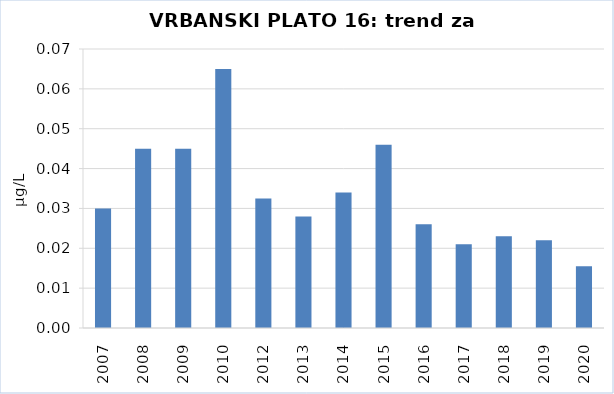
| Category | Vsota |
|---|---|
| 2007 | 0.03 |
| 2008 | 0.045 |
| 2009 | 0.045 |
| 2010 | 0.065 |
| 2012 | 0.032 |
| 2013 | 0.028 |
| 2014 | 0.034 |
| 2015 | 0.046 |
| 2016 | 0.026 |
| 2017 | 0.021 |
| 2018 | 0.023 |
| 2019 | 0.022 |
| 2020 | 0.016 |